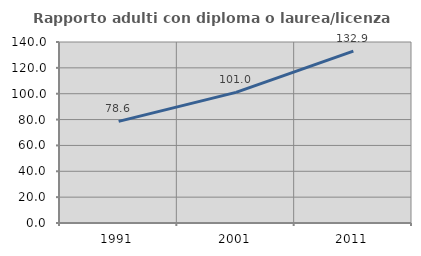
| Category | Rapporto adulti con diploma o laurea/licenza media  |
|---|---|
| 1991.0 | 78.602 |
| 2001.0 | 101.028 |
| 2011.0 | 132.886 |